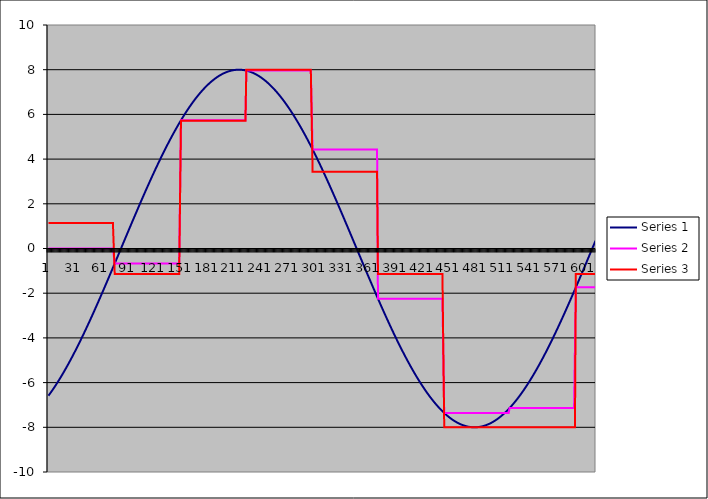
| Category | Series 1 | Series 2 | Series 3 |
|---|---|---|---|
| 0 | -6.587 | 0 | 1.143 |
| 1 | -6.532 | 0 | 1.143 |
| 2 | -6.476 | 0 | 1.143 |
| 3 | -6.42 | 0 | 1.143 |
| 4 | -6.362 | 0 | 1.143 |
| 5 | -6.304 | 0 | 1.143 |
| 6 | -6.245 | 0 | 1.143 |
| 7 | -6.185 | 0 | 1.143 |
| 8 | -6.124 | 0 | 1.143 |
| 9 | -6.062 | 0 | 1.143 |
| 10 | -5.999 | 0 | 1.143 |
| 11 | -5.935 | 0 | 1.143 |
| 12 | -5.871 | 0 | 1.143 |
| 13 | -5.806 | 0 | 1.143 |
| 14 | -5.74 | 0 | 1.143 |
| 15 | -5.673 | 0 | 1.143 |
| 16 | -5.605 | 0 | 1.143 |
| 17 | -5.536 | 0 | 1.143 |
| 18 | -5.467 | 0 | 1.143 |
| 19 | -5.397 | 0 | 1.143 |
| 20 | -5.326 | 0 | 1.143 |
| 21 | -5.254 | 0 | 1.143 |
| 22 | -5.182 | 0 | 1.143 |
| 23 | -5.109 | 0 | 1.143 |
| 24 | -5.035 | 0 | 1.143 |
| 25 | -4.96 | 0 | 1.143 |
| 26 | -4.885 | 0 | 1.143 |
| 27 | -4.809 | 0 | 1.143 |
| 28 | -4.732 | 0 | 1.143 |
| 29 | -4.655 | 0 | 1.143 |
| 30 | -4.577 | 0 | 1.143 |
| 31 | -4.498 | 0 | 1.143 |
| 32 | -4.419 | 0 | 1.143 |
| 33 | -4.339 | 0 | 1.143 |
| 34 | -4.259 | 0 | 1.143 |
| 35 | -4.178 | 0 | 1.143 |
| 36 | -4.096 | 0 | 1.143 |
| 37 | -4.014 | 0 | 1.143 |
| 38 | -3.931 | 0 | 1.143 |
| 39 | -3.847 | 0 | 1.143 |
| 40 | -3.763 | 0 | 1.143 |
| 41 | -3.679 | 0 | 1.143 |
| 42 | -3.594 | 0 | 1.143 |
| 43 | -3.508 | 0 | 1.143 |
| 44 | -3.422 | 0 | 1.143 |
| 45 | -3.335 | 0 | 1.143 |
| 46 | -3.248 | 0 | 1.143 |
| 47 | -3.161 | 0 | 1.143 |
| 48 | -3.073 | 0 | 1.143 |
| 49 | -2.984 | 0 | 1.143 |
| 50 | -2.896 | 0 | 1.143 |
| 51 | -2.806 | 0 | 1.143 |
| 52 | -2.717 | 0 | 1.143 |
| 53 | -2.627 | 0 | 1.143 |
| 54 | -2.536 | 0 | 1.143 |
| 55 | -2.446 | 0 | 1.143 |
| 56 | -2.354 | 0 | 1.143 |
| 57 | -2.263 | 0 | 1.143 |
| 58 | -2.171 | 0 | 1.143 |
| 59 | -2.079 | 0 | 1.143 |
| 60 | -1.987 | 0 | 1.143 |
| 61 | -1.894 | 0 | 1.143 |
| 62 | -1.801 | 0 | 1.143 |
| 63 | -1.708 | 0 | 1.143 |
| 64 | -1.615 | 0 | 1.143 |
| 65 | -1.521 | 0 | 1.143 |
| 66 | -1.427 | 0 | 1.143 |
| 67 | -1.333 | 0 | 1.143 |
| 68 | -1.239 | 0 | 1.143 |
| 69 | -1.144 | 0 | 1.143 |
| 70 | -1.05 | 0 | 1.143 |
| 71 | -0.955 | 0 | 1.143 |
| 72 | -0.86 | 0 | 1.143 |
| 73 | -0.765 | 0 | 1.143 |
| 74 | -0.67 | -0.67 | -1.143 |
| 75 | -0.575 | -0.67 | -1.143 |
| 76 | -0.479 | -0.67 | -1.143 |
| 77 | -0.384 | -0.67 | -1.143 |
| 78 | -0.289 | -0.67 | -1.143 |
| 79 | -0.193 | -0.67 | -1.143 |
| 80 | -0.098 | -0.67 | -1.143 |
| 81 | -0.002 | -0.67 | -1.143 |
| 82 | 0.093 | -0.67 | -1.143 |
| 83 | 0.189 | -0.67 | -1.143 |
| 84 | 0.284 | -0.67 | -1.143 |
| 85 | 0.38 | -0.67 | -1.143 |
| 86 | 0.475 | -0.67 | -1.143 |
| 87 | 0.57 | -0.67 | -1.143 |
| 88 | 0.666 | -0.67 | -1.143 |
| 89 | 0.761 | -0.67 | -1.143 |
| 90 | 0.856 | -0.67 | -1.143 |
| 91 | 0.951 | -0.67 | -1.143 |
| 92 | 1.045 | -0.67 | -1.143 |
| 93 | 1.14 | -0.67 | -1.143 |
| 94 | 1.234 | -0.67 | -1.143 |
| 95 | 1.329 | -0.67 | -1.143 |
| 96 | 1.423 | -0.67 | -1.143 |
| 97 | 1.517 | -0.67 | -1.143 |
| 98 | 1.61 | -0.67 | -1.143 |
| 99 | 1.704 | -0.67 | -1.143 |
| 100 | 1.797 | -0.67 | -1.143 |
| 101 | 1.89 | -0.67 | -1.143 |
| 102 | 1.983 | -0.67 | -1.143 |
| 103 | 2.075 | -0.67 | -1.143 |
| 104 | 2.167 | -0.67 | -1.143 |
| 105 | 2.259 | -0.67 | -1.143 |
| 106 | 2.35 | -0.67 | -1.143 |
| 107 | 2.441 | -0.67 | -1.143 |
| 108 | 2.532 | -0.67 | -1.143 |
| 109 | 2.623 | -0.67 | -1.143 |
| 110 | 2.713 | -0.67 | -1.143 |
| 111 | 2.802 | -0.67 | -1.143 |
| 112 | 2.891 | -0.67 | -1.143 |
| 113 | 2.98 | -0.67 | -1.143 |
| 114 | 3.069 | -0.67 | -1.143 |
| 115 | 3.157 | -0.67 | -1.143 |
| 116 | 3.244 | -0.67 | -1.143 |
| 117 | 3.331 | -0.67 | -1.143 |
| 118 | 3.418 | -0.67 | -1.143 |
| 119 | 3.504 | -0.67 | -1.143 |
| 120 | 3.59 | -0.67 | -1.143 |
| 121 | 3.675 | -0.67 | -1.143 |
| 122 | 3.759 | -0.67 | -1.143 |
| 123 | 3.843 | -0.67 | -1.143 |
| 124 | 3.927 | -0.67 | -1.143 |
| 125 | 4.01 | -0.67 | -1.143 |
| 126 | 4.092 | -0.67 | -1.143 |
| 127 | 4.174 | -0.67 | -1.143 |
| 128 | 4.255 | -0.67 | -1.143 |
| 129 | 4.336 | -0.67 | -1.143 |
| 130 | 4.416 | -0.67 | -1.143 |
| 131 | 4.495 | -0.67 | -1.143 |
| 132 | 4.574 | -0.67 | -1.143 |
| 133 | 4.652 | -0.67 | -1.143 |
| 134 | 4.729 | -0.67 | -1.143 |
| 135 | 4.806 | -0.67 | -1.143 |
| 136 | 4.882 | -0.67 | -1.143 |
| 137 | 4.957 | -0.67 | -1.143 |
| 138 | 5.032 | -0.67 | -1.143 |
| 139 | 5.105 | -0.67 | -1.143 |
| 140 | 5.179 | -0.67 | -1.143 |
| 141 | 5.251 | -0.67 | -1.143 |
| 142 | 5.323 | -0.67 | -1.143 |
| 143 | 5.394 | -0.67 | -1.143 |
| 144 | 5.464 | -0.67 | -1.143 |
| 145 | 5.533 | -0.67 | -1.143 |
| 146 | 5.602 | -0.67 | -1.143 |
| 147 | 5.669 | -0.67 | -1.143 |
| 148 | 5.736 | 5.736 | 5.714 |
| 149 | 5.803 | 5.736 | 5.714 |
| 150 | 5.868 | 5.736 | 5.714 |
| 151 | 5.932 | 5.736 | 5.714 |
| 152 | 5.996 | 5.736 | 5.714 |
| 153 | 6.059 | 5.736 | 5.714 |
| 154 | 6.121 | 5.736 | 5.714 |
| 155 | 6.182 | 5.736 | 5.714 |
| 156 | 6.242 | 5.736 | 5.714 |
| 157 | 6.301 | 5.736 | 5.714 |
| 158 | 6.36 | 5.736 | 5.714 |
| 159 | 6.417 | 5.736 | 5.714 |
| 160 | 6.474 | 5.736 | 5.714 |
| 161 | 6.529 | 5.736 | 5.714 |
| 162 | 6.584 | 5.736 | 5.714 |
| 163 | 6.638 | 5.736 | 5.714 |
| 164 | 6.691 | 5.736 | 5.714 |
| 165 | 6.743 | 5.736 | 5.714 |
| 166 | 6.794 | 5.736 | 5.714 |
| 167 | 6.844 | 5.736 | 5.714 |
| 168 | 6.892 | 5.736 | 5.714 |
| 169 | 6.94 | 5.736 | 5.714 |
| 170 | 6.987 | 5.736 | 5.714 |
| 171 | 7.033 | 5.736 | 5.714 |
| 172 | 7.078 | 5.736 | 5.714 |
| 173 | 7.122 | 5.736 | 5.714 |
| 174 | 7.165 | 5.736 | 5.714 |
| 175 | 7.207 | 5.736 | 5.714 |
| 176 | 7.248 | 5.736 | 5.714 |
| 177 | 7.288 | 5.736 | 5.714 |
| 178 | 7.327 | 5.736 | 5.714 |
| 179 | 7.365 | 5.736 | 5.714 |
| 180 | 7.402 | 5.736 | 5.714 |
| 181 | 7.437 | 5.736 | 5.714 |
| 182 | 7.472 | 5.736 | 5.714 |
| 183 | 7.506 | 5.736 | 5.714 |
| 184 | 7.538 | 5.736 | 5.714 |
| 185 | 7.57 | 5.736 | 5.714 |
| 186 | 7.6 | 5.736 | 5.714 |
| 187 | 7.629 | 5.736 | 5.714 |
| 188 | 7.657 | 5.736 | 5.714 |
| 189 | 7.685 | 5.736 | 5.714 |
| 190 | 7.711 | 5.736 | 5.714 |
| 191 | 7.735 | 5.736 | 5.714 |
| 192 | 7.759 | 5.736 | 5.714 |
| 193 | 7.782 | 5.736 | 5.714 |
| 194 | 7.804 | 5.736 | 5.714 |
| 195 | 7.824 | 5.736 | 5.714 |
| 196 | 7.843 | 5.736 | 5.714 |
| 197 | 7.862 | 5.736 | 5.714 |
| 198 | 7.879 | 5.736 | 5.714 |
| 199 | 7.895 | 5.736 | 5.714 |
| 200 | 7.91 | 5.736 | 5.714 |
| 201 | 7.923 | 5.736 | 5.714 |
| 202 | 7.936 | 5.736 | 5.714 |
| 203 | 7.947 | 5.736 | 5.714 |
| 204 | 7.958 | 5.736 | 5.714 |
| 205 | 7.967 | 5.736 | 5.714 |
| 206 | 7.975 | 5.736 | 5.714 |
| 207 | 7.982 | 5.736 | 5.714 |
| 208 | 7.988 | 5.736 | 5.714 |
| 209 | 7.993 | 5.736 | 5.714 |
| 210 | 7.996 | 5.736 | 5.714 |
| 211 | 7.999 | 5.736 | 5.714 |
| 212 | 8 | 5.736 | 5.714 |
| 213 | 8 | 5.736 | 5.714 |
| 214 | 7.999 | 5.736 | 5.714 |
| 215 | 7.997 | 5.736 | 5.714 |
| 216 | 7.993 | 5.736 | 5.714 |
| 217 | 7.989 | 5.736 | 5.714 |
| 218 | 7.983 | 5.736 | 5.714 |
| 219 | 7.977 | 5.736 | 5.714 |
| 220 | 7.969 | 5.736 | 5.714 |
| 221 | 7.96 | 7.96 | 8 |
| 222 | 7.95 | 7.96 | 8 |
| 223 | 7.938 | 7.96 | 8 |
| 224 | 7.926 | 7.96 | 8 |
| 225 | 7.913 | 7.96 | 8 |
| 226 | 7.898 | 7.96 | 8 |
| 227 | 7.882 | 7.96 | 8 |
| 228 | 7.865 | 7.96 | 8 |
| 229 | 7.847 | 7.96 | 8 |
| 230 | 7.828 | 7.96 | 8 |
| 231 | 7.808 | 7.96 | 8 |
| 232 | 7.786 | 7.96 | 8 |
| 233 | 7.764 | 7.96 | 8 |
| 234 | 7.74 | 7.96 | 8 |
| 235 | 7.716 | 7.96 | 8 |
| 236 | 7.69 | 7.96 | 8 |
| 237 | 7.663 | 7.96 | 8 |
| 238 | 7.635 | 7.96 | 8 |
| 239 | 7.606 | 7.96 | 8 |
| 240 | 7.576 | 7.96 | 8 |
| 241 | 7.545 | 7.96 | 8 |
| 242 | 7.512 | 7.96 | 8 |
| 243 | 7.479 | 7.96 | 8 |
| 244 | 7.445 | 7.96 | 8 |
| 245 | 7.409 | 7.96 | 8 |
| 246 | 7.373 | 7.96 | 8 |
| 247 | 7.335 | 7.96 | 8 |
| 248 | 7.296 | 7.96 | 8 |
| 249 | 7.257 | 7.96 | 8 |
| 250 | 7.216 | 7.96 | 8 |
| 251 | 7.174 | 7.96 | 8 |
| 252 | 7.131 | 7.96 | 8 |
| 253 | 7.088 | 7.96 | 8 |
| 254 | 7.043 | 7.96 | 8 |
| 255 | 6.997 | 7.96 | 8 |
| 256 | 6.95 | 7.96 | 8 |
| 257 | 6.902 | 7.96 | 8 |
| 258 | 6.854 | 7.96 | 8 |
| 259 | 6.804 | 7.96 | 8 |
| 260 | 6.753 | 7.96 | 8 |
| 261 | 6.701 | 7.96 | 8 |
| 262 | 6.649 | 7.96 | 8 |
| 263 | 6.595 | 7.96 | 8 |
| 264 | 6.541 | 7.96 | 8 |
| 265 | 6.485 | 7.96 | 8 |
| 266 | 6.429 | 7.96 | 8 |
| 267 | 6.372 | 7.96 | 8 |
| 268 | 6.313 | 7.96 | 8 |
| 269 | 6.254 | 7.96 | 8 |
| 270 | 6.194 | 7.96 | 8 |
| 271 | 6.133 | 7.96 | 8 |
| 272 | 6.072 | 7.96 | 8 |
| 273 | 6.009 | 7.96 | 8 |
| 274 | 5.946 | 7.96 | 8 |
| 275 | 5.881 | 7.96 | 8 |
| 276 | 5.816 | 7.96 | 8 |
| 277 | 5.75 | 7.96 | 8 |
| 278 | 5.683 | 7.96 | 8 |
| 279 | 5.616 | 7.96 | 8 |
| 280 | 5.547 | 7.96 | 8 |
| 281 | 5.478 | 7.96 | 8 |
| 282 | 5.408 | 7.96 | 8 |
| 283 | 5.337 | 7.96 | 8 |
| 284 | 5.266 | 7.96 | 8 |
| 285 | 5.193 | 7.96 | 8 |
| 286 | 5.12 | 7.96 | 8 |
| 287 | 5.047 | 7.96 | 8 |
| 288 | 4.972 | 7.96 | 8 |
| 289 | 4.897 | 7.96 | 8 |
| 290 | 4.821 | 7.96 | 8 |
| 291 | 4.745 | 7.96 | 8 |
| 292 | 4.667 | 7.96 | 8 |
| 293 | 4.59 | 7.96 | 8 |
| 294 | 4.511 | 7.96 | 8 |
| 295 | 4.432 | 4.432 | 3.429 |
| 296 | 4.352 | 4.432 | 3.429 |
| 297 | 4.271 | 4.432 | 3.429 |
| 298 | 4.19 | 4.432 | 3.429 |
| 299 | 4.109 | 4.432 | 3.429 |
| 300 | 4.027 | 4.432 | 3.429 |
| 301 | 3.944 | 4.432 | 3.429 |
| 302 | 3.86 | 4.432 | 3.429 |
| 303 | 3.776 | 4.432 | 3.429 |
| 304 | 3.692 | 4.432 | 3.429 |
| 305 | 3.607 | 4.432 | 3.429 |
| 306 | 3.522 | 4.432 | 3.429 |
| 307 | 3.435 | 4.432 | 3.429 |
| 308 | 3.349 | 4.432 | 3.429 |
| 309 | 3.262 | 4.432 | 3.429 |
| 310 | 3.175 | 4.432 | 3.429 |
| 311 | 3.087 | 4.432 | 3.429 |
| 312 | 2.998 | 4.432 | 3.429 |
| 313 | 2.91 | 4.432 | 3.429 |
| 314 | 2.82 | 4.432 | 3.429 |
| 315 | 2.731 | 4.432 | 3.429 |
| 316 | 2.641 | 4.432 | 3.429 |
| 317 | 2.551 | 4.432 | 3.429 |
| 318 | 2.46 | 4.432 | 3.429 |
| 319 | 2.369 | 4.432 | 3.429 |
| 320 | 2.277 | 4.432 | 3.429 |
| 321 | 2.186 | 4.432 | 3.429 |
| 322 | 2.094 | 4.432 | 3.429 |
| 323 | 2.001 | 4.432 | 3.429 |
| 324 | 1.909 | 4.432 | 3.429 |
| 325 | 1.816 | 4.432 | 3.429 |
| 326 | 1.723 | 4.432 | 3.429 |
| 327 | 1.629 | 4.432 | 3.429 |
| 328 | 1.536 | 4.432 | 3.429 |
| 329 | 1.442 | 4.432 | 3.429 |
| 330 | 1.348 | 4.432 | 3.429 |
| 331 | 1.254 | 4.432 | 3.429 |
| 332 | 1.159 | 4.432 | 3.429 |
| 333 | 1.065 | 4.432 | 3.429 |
| 334 | 0.97 | 4.432 | 3.429 |
| 335 | 0.875 | 4.432 | 3.429 |
| 336 | 0.78 | 4.432 | 3.429 |
| 337 | 0.685 | 4.432 | 3.429 |
| 338 | 0.59 | 4.432 | 3.429 |
| 339 | 0.494 | 4.432 | 3.429 |
| 340 | 0.399 | 4.432 | 3.429 |
| 341 | 0.304 | 4.432 | 3.429 |
| 342 | 0.208 | 4.432 | 3.429 |
| 343 | 0.113 | 4.432 | 3.429 |
| 344 | 0.017 | 4.432 | 3.429 |
| 345 | -0.078 | 4.432 | 3.429 |
| 346 | -0.174 | 4.432 | 3.429 |
| 347 | -0.269 | 4.432 | 3.429 |
| 348 | -0.365 | 4.432 | 3.429 |
| 349 | -0.46 | 4.432 | 3.429 |
| 350 | -0.555 | 4.432 | 3.429 |
| 351 | -0.651 | 4.432 | 3.429 |
| 352 | -0.746 | 4.432 | 3.429 |
| 353 | -0.841 | 4.432 | 3.429 |
| 354 | -0.936 | 4.432 | 3.429 |
| 355 | -1.03 | 4.432 | 3.429 |
| 356 | -1.125 | 4.432 | 3.429 |
| 357 | -1.219 | 4.432 | 3.429 |
| 358 | -1.314 | 4.432 | 3.429 |
| 359 | -1.408 | 4.432 | 3.429 |
| 360 | -1.502 | 4.432 | 3.429 |
| 361 | -1.596 | 4.432 | 3.429 |
| 362 | -1.689 | 4.432 | 3.429 |
| 363 | -1.782 | 4.432 | 3.429 |
| 364 | -1.875 | 4.432 | 3.429 |
| 365 | -1.968 | 4.432 | 3.429 |
| 366 | -2.06 | 4.432 | 3.429 |
| 367 | -2.152 | 4.432 | 3.429 |
| 368 | -2.244 | -2.244 | -1.143 |
| 369 | -2.336 | -2.244 | -1.143 |
| 370 | -2.427 | -2.244 | -1.143 |
| 371 | -2.518 | -2.244 | -1.143 |
| 372 | -2.608 | -2.244 | -1.143 |
| 373 | -2.698 | -2.244 | -1.143 |
| 374 | -2.788 | -2.244 | -1.143 |
| 375 | -2.877 | -2.244 | -1.143 |
| 376 | -2.966 | -2.244 | -1.143 |
| 377 | -3.055 | -2.244 | -1.143 |
| 378 | -3.143 | -2.244 | -1.143 |
| 379 | -3.23 | -2.244 | -1.143 |
| 380 | -3.318 | -2.244 | -1.143 |
| 381 | -3.404 | -2.244 | -1.143 |
| 382 | -3.49 | -2.244 | -1.143 |
| 383 | -3.576 | -2.244 | -1.143 |
| 384 | -3.661 | -2.244 | -1.143 |
| 385 | -3.746 | -2.244 | -1.143 |
| 386 | -3.83 | -2.244 | -1.143 |
| 387 | -3.914 | -2.244 | -1.143 |
| 388 | -3.997 | -2.244 | -1.143 |
| 389 | -4.079 | -2.244 | -1.143 |
| 390 | -4.161 | -2.244 | -1.143 |
| 391 | -4.242 | -2.244 | -1.143 |
| 392 | -4.323 | -2.244 | -1.143 |
| 393 | -4.403 | -2.244 | -1.143 |
| 394 | -4.482 | -2.244 | -1.143 |
| 395 | -4.561 | -2.244 | -1.143 |
| 396 | -4.639 | -2.244 | -1.143 |
| 397 | -4.717 | -2.244 | -1.143 |
| 398 | -4.794 | -2.244 | -1.143 |
| 399 | -4.87 | -2.244 | -1.143 |
| 400 | -4.945 | -2.244 | -1.143 |
| 401 | -5.02 | -2.244 | -1.143 |
| 402 | -5.094 | -2.244 | -1.143 |
| 403 | -5.167 | -2.244 | -1.143 |
| 404 | -5.24 | -2.244 | -1.143 |
| 405 | -5.311 | -2.244 | -1.143 |
| 406 | -5.382 | -2.244 | -1.143 |
| 407 | -5.453 | -2.244 | -1.143 |
| 408 | -5.522 | -2.244 | -1.143 |
| 409 | -5.591 | -2.244 | -1.143 |
| 410 | -5.659 | -2.244 | -1.143 |
| 411 | -5.726 | -2.244 | -1.143 |
| 412 | -5.792 | -2.244 | -1.143 |
| 413 | -5.858 | -2.244 | -1.143 |
| 414 | -5.922 | -2.244 | -1.143 |
| 415 | -5.986 | -2.244 | -1.143 |
| 416 | -6.049 | -2.244 | -1.143 |
| 417 | -6.111 | -2.244 | -1.143 |
| 418 | -6.172 | -2.244 | -1.143 |
| 419 | -6.233 | -2.244 | -1.143 |
| 420 | -6.292 | -2.244 | -1.143 |
| 421 | -6.351 | -2.244 | -1.143 |
| 422 | -6.408 | -2.244 | -1.143 |
| 423 | -6.465 | -2.244 | -1.143 |
| 424 | -6.521 | -2.244 | -1.143 |
| 425 | -6.576 | -2.244 | -1.143 |
| 426 | -6.63 | -2.244 | -1.143 |
| 427 | -6.682 | -2.244 | -1.143 |
| 428 | -6.735 | -2.244 | -1.143 |
| 429 | -6.786 | -2.244 | -1.143 |
| 430 | -6.836 | -2.244 | -1.143 |
| 431 | -6.885 | -2.244 | -1.143 |
| 432 | -6.933 | -2.244 | -1.143 |
| 433 | -6.98 | -2.244 | -1.143 |
| 434 | -7.026 | -2.244 | -1.143 |
| 435 | -7.071 | -2.244 | -1.143 |
| 436 | -7.116 | -2.244 | -1.143 |
| 437 | -7.159 | -2.244 | -1.143 |
| 438 | -7.201 | -2.244 | -1.143 |
| 439 | -7.242 | -2.244 | -1.143 |
| 440 | -7.282 | -2.244 | -1.143 |
| 441 | -7.321 | -2.244 | -1.143 |
| 442 | -7.359 | -7.359 | -8 |
| 443 | -7.396 | -7.359 | -8 |
| 444 | -7.432 | -7.359 | -8 |
| 445 | -7.467 | -7.359 | -8 |
| 446 | -7.5 | -7.359 | -8 |
| 447 | -7.533 | -7.359 | -8 |
| 448 | -7.565 | -7.359 | -8 |
| 449 | -7.595 | -7.359 | -8 |
| 450 | -7.625 | -7.359 | -8 |
| 451 | -7.653 | -7.359 | -8 |
| 452 | -7.68 | -7.359 | -8 |
| 453 | -7.707 | -7.359 | -8 |
| 454 | -7.732 | -7.359 | -8 |
| 455 | -7.756 | -7.359 | -8 |
| 456 | -7.778 | -7.359 | -8 |
| 457 | -7.8 | -7.359 | -8 |
| 458 | -7.821 | -7.359 | -8 |
| 459 | -7.84 | -7.359 | -8 |
| 460 | -7.859 | -7.359 | -8 |
| 461 | -7.876 | -7.359 | -8 |
| 462 | -7.892 | -7.359 | -8 |
| 463 | -7.907 | -7.359 | -8 |
| 464 | -7.921 | -7.359 | -8 |
| 465 | -7.934 | -7.359 | -8 |
| 466 | -7.946 | -7.359 | -8 |
| 467 | -7.956 | -7.359 | -8 |
| 468 | -7.966 | -7.359 | -8 |
| 469 | -7.974 | -7.359 | -8 |
| 470 | -7.981 | -7.359 | -8 |
| 471 | -7.987 | -7.359 | -8 |
| 472 | -7.992 | -7.359 | -8 |
| 473 | -7.996 | -7.359 | -8 |
| 474 | -7.998 | -7.359 | -8 |
| 475 | -8 | -7.359 | -8 |
| 476 | -8 | -7.359 | -8 |
| 477 | -7.999 | -7.359 | -8 |
| 478 | -7.997 | -7.359 | -8 |
| 479 | -7.994 | -7.359 | -8 |
| 480 | -7.99 | -7.359 | -8 |
| 481 | -7.984 | -7.359 | -8 |
| 482 | -7.978 | -7.359 | -8 |
| 483 | -7.97 | -7.359 | -8 |
| 484 | -7.961 | -7.359 | -8 |
| 485 | -7.951 | -7.359 | -8 |
| 486 | -7.94 | -7.359 | -8 |
| 487 | -7.928 | -7.359 | -8 |
| 488 | -7.915 | -7.359 | -8 |
| 489 | -7.9 | -7.359 | -8 |
| 490 | -7.885 | -7.359 | -8 |
| 491 | -7.868 | -7.359 | -8 |
| 492 | -7.85 | -7.359 | -8 |
| 493 | -7.831 | -7.359 | -8 |
| 494 | -7.811 | -7.359 | -8 |
| 495 | -7.79 | -7.359 | -8 |
| 496 | -7.768 | -7.359 | -8 |
| 497 | -7.744 | -7.359 | -8 |
| 498 | -7.72 | -7.359 | -8 |
| 499 | -7.694 | -7.359 | -8 |
| 500 | -7.667 | -7.359 | -8 |
| 501 | -7.64 | -7.359 | -8 |
| 502 | -7.611 | -7.359 | -8 |
| 503 | -7.581 | -7.359 | -8 |
| 504 | -7.55 | -7.359 | -8 |
| 505 | -7.518 | -7.359 | -8 |
| 506 | -7.484 | -7.359 | -8 |
| 507 | -7.45 | -7.359 | -8 |
| 508 | -7.415 | -7.359 | -8 |
| 509 | -7.378 | -7.359 | -8 |
| 510 | -7.341 | -7.359 | -8 |
| 511 | -7.302 | -7.359 | -8 |
| 512 | -7.263 | -7.359 | -8 |
| 513 | -7.222 | -7.359 | -8 |
| 514 | -7.181 | -7.359 | -8 |
| 515 | -7.138 | -7.138 | -8 |
| 516 | -7.095 | -7.138 | -8 |
| 517 | -7.05 | -7.138 | -8 |
| 518 | -7.004 | -7.138 | -8 |
| 519 | -6.958 | -7.138 | -8 |
| 520 | -6.91 | -7.138 | -8 |
| 521 | -6.861 | -7.138 | -8 |
| 522 | -6.812 | -7.138 | -8 |
| 523 | -6.761 | -7.138 | -8 |
| 524 | -6.71 | -7.138 | -8 |
| 525 | -6.657 | -7.138 | -8 |
| 526 | -6.604 | -7.138 | -8 |
| 527 | -6.549 | -7.138 | -8 |
| 528 | -6.494 | -7.138 | -8 |
| 529 | -6.438 | -7.138 | -8 |
| 530 | -6.381 | -7.138 | -8 |
| 531 | -6.323 | -7.138 | -8 |
| 532 | -6.264 | -7.138 | -8 |
| 533 | -6.204 | -7.138 | -8 |
| 534 | -6.143 | -7.138 | -8 |
| 535 | -6.081 | -7.138 | -8 |
| 536 | -6.019 | -7.138 | -8 |
| 537 | -5.956 | -7.138 | -8 |
| 538 | -5.891 | -7.138 | -8 |
| 539 | -5.826 | -7.138 | -8 |
| 540 | -5.761 | -7.138 | -8 |
| 541 | -5.694 | -7.138 | -8 |
| 542 | -5.626 | -7.138 | -8 |
| 543 | -5.558 | -7.138 | -8 |
| 544 | -5.489 | -7.138 | -8 |
| 545 | -5.419 | -7.138 | -8 |
| 546 | -5.348 | -7.138 | -8 |
| 547 | -5.277 | -7.138 | -8 |
| 548 | -5.205 | -7.138 | -8 |
| 549 | -5.132 | -7.138 | -8 |
| 550 | -5.058 | -7.138 | -8 |
| 551 | -4.984 | -7.138 | -8 |
| 552 | -4.909 | -7.138 | -8 |
| 553 | -4.833 | -7.138 | -8 |
| 554 | -4.757 | -7.138 | -8 |
| 555 | -4.68 | -7.138 | -8 |
| 556 | -4.602 | -7.138 | -8 |
| 557 | -4.523 | -7.138 | -8 |
| 558 | -4.444 | -7.138 | -8 |
| 559 | -4.365 | -7.138 | -8 |
| 560 | -4.284 | -7.138 | -8 |
| 561 | -4.203 | -7.138 | -8 |
| 562 | -4.122 | -7.138 | -8 |
| 563 | -4.04 | -7.138 | -8 |
| 564 | -3.957 | -7.138 | -8 |
| 565 | -3.874 | -7.138 | -8 |
| 566 | -3.79 | -7.138 | -8 |
| 567 | -3.705 | -7.138 | -8 |
| 568 | -3.62 | -7.138 | -8 |
| 569 | -3.535 | -7.138 | -8 |
| 570 | -3.449 | -7.138 | -8 |
| 571 | -3.363 | -7.138 | -8 |
| 572 | -3.276 | -7.138 | -8 |
| 573 | -3.188 | -7.138 | -8 |
| 574 | -3.101 | -7.138 | -8 |
| 575 | -3.012 | -7.138 | -8 |
| 576 | -2.924 | -7.138 | -8 |
| 577 | -2.835 | -7.138 | -8 |
| 578 | -2.745 | -7.138 | -8 |
| 579 | -2.655 | -7.138 | -8 |
| 580 | -2.565 | -7.138 | -8 |
| 581 | -2.474 | -7.138 | -8 |
| 582 | -2.383 | -7.138 | -8 |
| 583 | -2.292 | -7.138 | -8 |
| 584 | -2.2 | -7.138 | -8 |
| 585 | -2.108 | -7.138 | -8 |
| 586 | -2.016 | -7.138 | -8 |
| 587 | -1.923 | -7.138 | -8 |
| 588 | -1.831 | -7.138 | -8 |
| 589 | -1.737 | -1.737 | -1.143 |
| 590 | -1.644 | -1.737 | -1.143 |
| 591 | -1.551 | -1.737 | -1.143 |
| 592 | -1.457 | -1.737 | -1.143 |
| 593 | -1.363 | -1.737 | -1.143 |
| 594 | -1.269 | -1.737 | -1.143 |
| 595 | -1.174 | -1.737 | -1.143 |
| 596 | -1.08 | -1.737 | -1.143 |
| 597 | -0.985 | -1.737 | -1.143 |
| 598 | -0.89 | -1.737 | -1.143 |
| 599 | -0.795 | -1.737 | -1.143 |
| 600 | -0.7 | -1.737 | -1.143 |
| 601 | -0.605 | -1.737 | -1.143 |
| 602 | -0.51 | -1.737 | -1.143 |
| 603 | -0.414 | -1.737 | -1.143 |
| 604 | -0.319 | -1.737 | -1.143 |
| 605 | -0.223 | -1.737 | -1.143 |
| 606 | -0.128 | -1.737 | -1.143 |
| 607 | -0.032 | -1.737 | -1.143 |
| 608 | 0.063 | -1.737 | -1.143 |
| 609 | 0.159 | -1.737 | -1.143 |
| 610 | 0.254 | -1.737 | -1.143 |
| 611 | 0.35 | -1.737 | -1.143 |